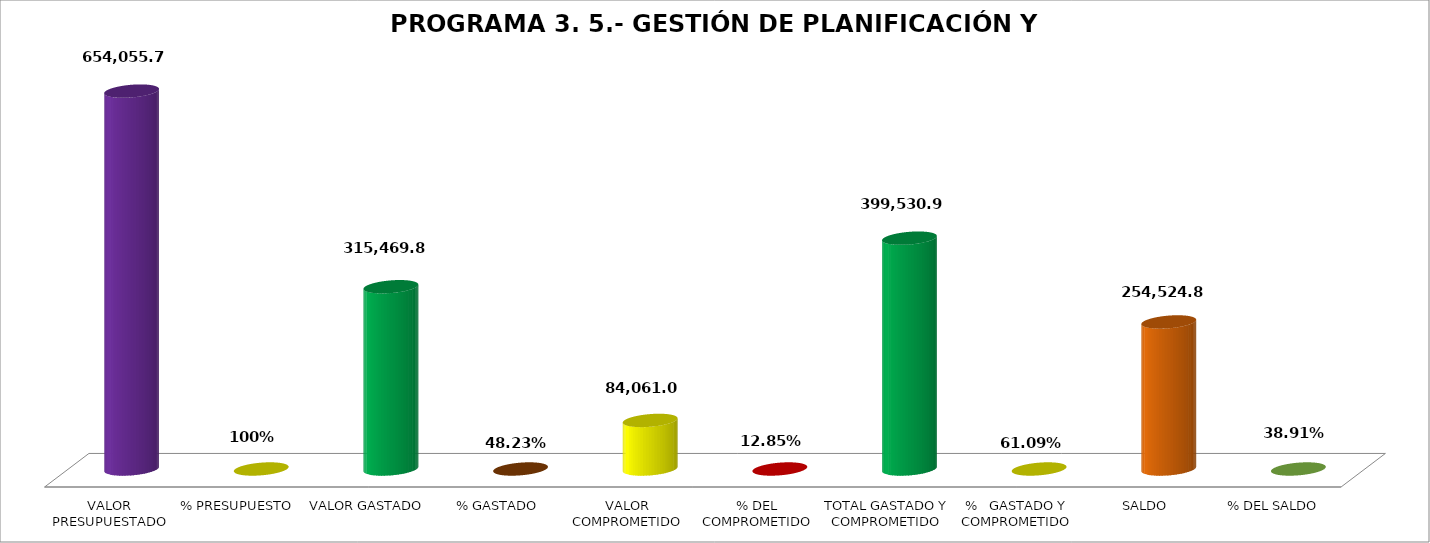
| Category | PROGRAMA 3. 5.- GESTIÓN DE PLANIFICACIÓN Y PROYECTOS |
|---|---|
| VALOR PRESUPUESTADO | 654055.75 |
| % PRESUPUESTO | 1 |
| VALOR GASTADO | 315469.89 |
| % GASTADO | 0.482 |
| VALOR COMPROMETIDO | 84061.04 |
| % DEL COMPROMETIDO | 0.129 |
| TOTAL GASTADO Y COMPROMETIDO | 399530.93 |
| %   GASTADO Y COMPROMETIDO | 0.611 |
| SALDO | 254524.82 |
| % DEL SALDO | 0.389 |